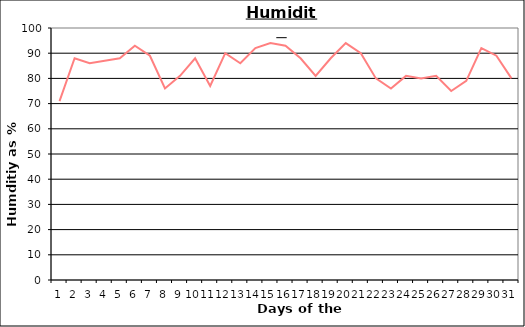
| Category | Series 0 |
|---|---|
| 0 | 71 |
| 1 | 88 |
| 2 | 86 |
| 3 | 87 |
| 4 | 88 |
| 5 | 93 |
| 6 | 89 |
| 7 | 76 |
| 8 | 81 |
| 9 | 88 |
| 10 | 77 |
| 11 | 90 |
| 12 | 86 |
| 13 | 92 |
| 14 | 94 |
| 15 | 93 |
| 16 | 88 |
| 17 | 81 |
| 18 | 88 |
| 19 | 94 |
| 20 | 90 |
| 21 | 80 |
| 22 | 76 |
| 23 | 81 |
| 24 | 80 |
| 25 | 81 |
| 26 | 75 |
| 27 | 79 |
| 28 | 92 |
| 29 | 89 |
| 30 | 80 |